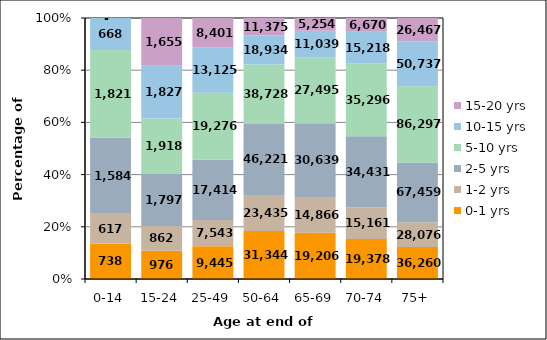
| Category | 0-1 yrs | 1-2 yrs | 2-5 yrs | 5-10 yrs | 10-15 yrs | 15-20 yrs |
|---|---|---|---|---|---|---|
| 0-14 | 738 | 617 | 1584 | 1821 | 668 | 0 |
| 15-24 | 976 | 862 | 1797 | 1918 | 1827 | 1655 |
| 25-49 | 9445 | 7543 | 17414 | 19276 | 13125 | 8401 |
| 50-64 | 31344 | 23435 | 46221 | 38728 | 18934 | 11375 |
| 65-69 | 19206 | 14866 | 30639 | 27495 | 11039 | 5254 |
| 70-74 | 19378 | 15161 | 34431 | 35296 | 15218 | 6670 |
| 75+ | 36260 | 28076 | 67459 | 86297 | 50737 | 26467 |